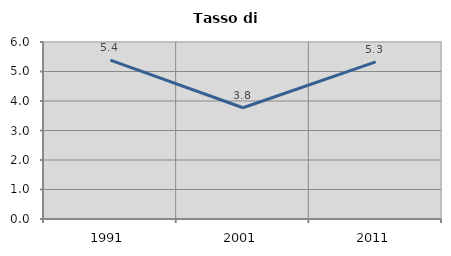
| Category | Tasso di disoccupazione   |
|---|---|
| 1991.0 | 5.387 |
| 2001.0 | 3.771 |
| 2011.0 | 5.329 |